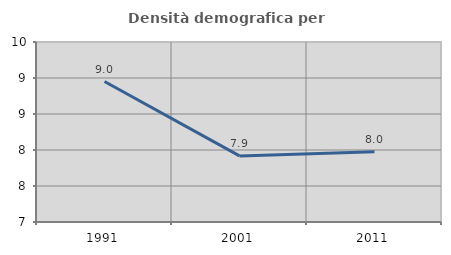
| Category | Densità demografica |
|---|---|
| 1991.0 | 8.951 |
| 2001.0 | 7.918 |
| 2011.0 | 7.975 |